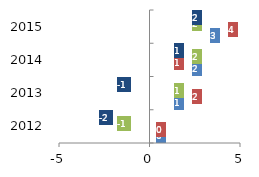
| Category | ACC Ltd Freight & Forwarding | Ambuja Cement Freight & Forwarding | JK Lakshmi Cement Freight & Forwarding | Ultratech Cement Freight & Forwarding |
|---|---|---|---|---|
| 2012.0 | 0 | 0 | -1 | -2 |
| 2013.0 | 1 | 2 | 1 | -1 |
| 2014.0 | 2 | 1 | 2 | 1 |
| 2015.0 | 3 | 4 | 2 | 2 |